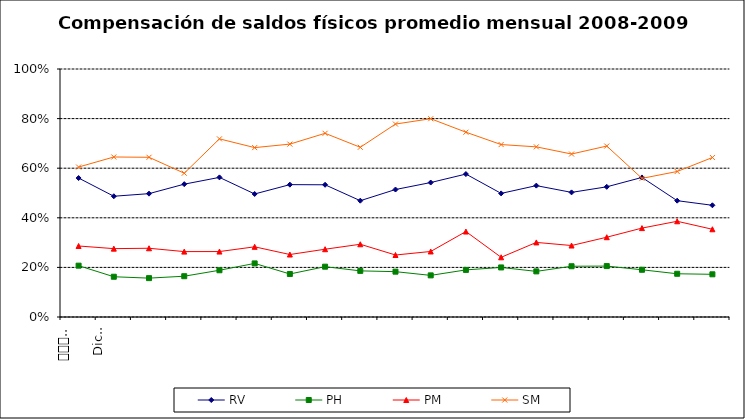
| Category | RV | PH | PM | SM |
|---|---|---|---|---|
| 0 | 0.56 | 0.207 | 0.286 | 0.605 |
| 1 | 0.487 | 0.162 | 0.276 | 0.645 |
| 2 | 0.497 | 0.157 | 0.277 | 0.644 |
| 3 | 0.536 | 0.164 | 0.264 | 0.58 |
| 4 | 0.563 | 0.188 | 0.264 | 0.718 |
| 5 | 0.496 | 0.216 | 0.283 | 0.683 |
| 6 | 0.534 | 0.174 | 0.252 | 0.697 |
| 7 | 0.533 | 0.203 | 0.273 | 0.741 |
| 8 | 0.469 | 0.186 | 0.293 | 0.684 |
| 9 | 0.514 | 0.183 | 0.25 | 0.778 |
| 10 | 0.542 | 0.168 | 0.264 | 0.8 |
| 11 | 0.576 | 0.19 | 0.345 | 0.745 |
| 12 | 0.498 | 0.2 | 0.241 | 0.695 |
| 13 | 0.53 | 0.184 | 0.301 | 0.686 |
| 14 | 0.502 | 0.205 | 0.288 | 0.657 |
| 15 | 0.525 | 0.205 | 0.322 | 0.689 |
| 16 | 0.563 | 0.19 | 0.358 | 0.559 |
| 17 | 0.469 | 0.174 | 0.386 | 0.587 |
| 18 | 0.45 | 0.172 | 0.354 | 0.643 |